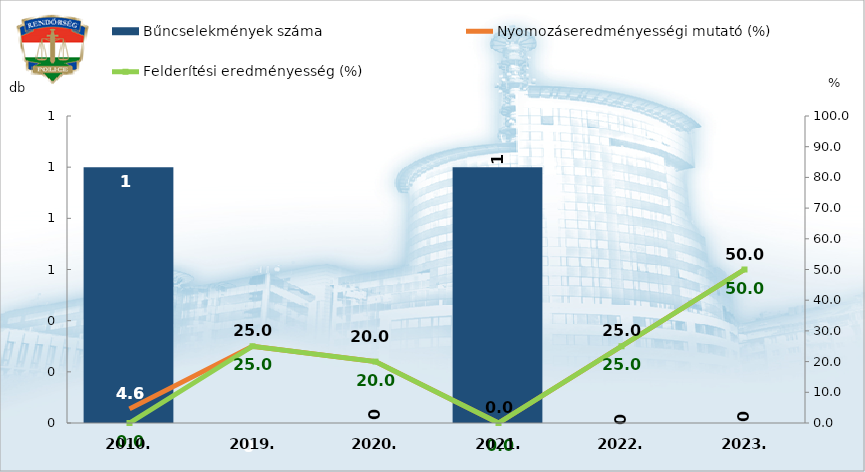
| Category | Bűncselekmények száma |
|---|---|
| 2010. | 1 |
| 2019. | 0 |
| 2020. | 0 |
| 2021. | 1 |
| 2022. | 0 |
| 2023. | 0 |